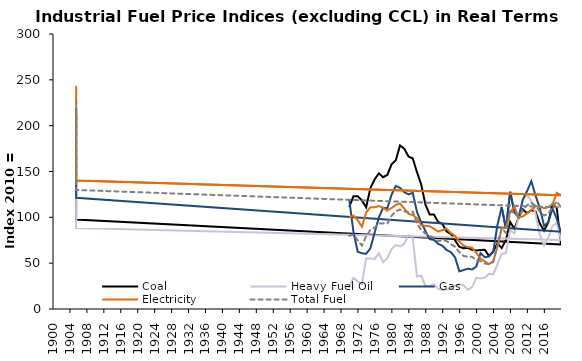
| Category | Coal | Heavy Fuel Oil | Gas | Electricity | Total Fuel |
|---|---|---|---|---|---|
| 1970-01-01 | 111.516 | 24.5 | 119.719 | 99.851 | 79.811 |
| 1971-01-01 | 122.971 | 33.936 | 84.229 | 102.041 | 81.375 |
| 1972-01-01 | 123.096 | 30.142 | 62.531 | 96.971 | 74.948 |
| 1973-01-01 | 118.387 | 27.095 | 60.768 | 89.67 | 69.19 |
| 1974-01-01 | 110.844 | 55.242 | 60.297 | 105.287 | 79.297 |
| 1975-01-01 | 131.864 | 55.18 | 66.123 | 110.923 | 86.286 |
| 1976-01-01 | 141.234 | 54.681 | 83.321 | 110.962 | 88.887 |
| 1977-01-01 | 148.103 | 60.917 | 99.926 | 112.312 | 93.299 |
| 1978-01-01 | 143.774 | 51.086 | 110.356 | 110.517 | 93.429 |
| 1979-01-01 | 146.254 | 55.453 | 110.001 | 107.329 | 93.032 |
| 1980-01-01 | 157.849 | 65.408 | 124.568 | 110.185 | 101.689 |
| 1981-01-01 | 162.258 | 69.706 | 134.321 | 113.51 | 106.484 |
| 1982-01-01 | 178.387 | 68.18 | 132.193 | 115.131 | 108.575 |
| 1983-01-01 | 174.888 | 71.134 | 127.398 | 109.509 | 106.567 |
| 1984-01-01 | 166.415 | 80.397 | 125.12 | 103.91 | 105.735 |
| 1985-01-01 | 164.124 | 77.368 | 126.756 | 102.468 | 106.221 |
| 1986-01-01 | 149.243 | 35.619 | 105.82 | 99.06 | 92.691 |
| 1987-01-01 | 135.814 | 36.161 | 94.58 | 91.267 | 86.415 |
| 1988-01-01 | 113.892 | 25.197 | 84.992 | 90.822 | 82.267 |
| 1989-01-01 | 103.2 | 25.443 | 76.182 | 90.257 | 79.623 |
| 1990-01-01 | 103.122 | 26.893 | 75.343 | 87.535 | 77.448 |
| 1991-01-01 | 94.955 | 22.083 | 71.105 | 84.538 | 73.921 |
| 1992-01-01 | 92.794 | 20.495 | 68.987 | 86.104 | 75.396 |
| 1993-01-01 | 84.456 | 21.179 | 64.387 | 87.456 | 74.023 |
| 1994-01-01 | 82.054 | 22.535 | 62.029 | 82.88 | 70.633 |
| 1995-01-01 | 74.729 | 25.548 | 56.253 | 79.713 | 67.799 |
| 1996-01-01 | 67.895 | 26.95 | 41.055 | 73.51 | 61.932 |
| 1997-01-01 | 66.204 | 25.742 | 42.454 | 69.213 | 57.936 |
| 1998-01-01 | 66.71 | 21.13 | 44.012 | 67.524 | 56.938 |
| 1999-01-01 | 64.718 | 23.825 | 43.114 | 66.903 | 56.995 |
| 2000-01-01 | 63.956 | 34.033 | 46.294 | 61.205 | 52.958 |
| 2001-01-01 | 64.478 | 33.394 | 60.946 | 55.036 | 52.173 |
| 2002-01-01 | 64.658 | 34.224 | 56.384 | 51.93 | 49.663 |
| 2003-01-01 | 57.812 | 38.521 | 57.317 | 48.985 | 48.803 |
| 2004-01-01 | 62.727 | 37.795 | 62.198 | 52.046 | 51.226 |
| 2005-01-01 | 71.564 | 48.78 | 91.859 | 67.731 | 69.864 |
| 2006-01-01 | 66.475 | 60.378 | 111.201 | 88.305 | 88.486 |
| 2007-01-01 | 75.408 | 61.043 | 87.554 | 88.504 | 82.967 |
| 2008-01-01 | 94.752 | 86.145 | 127.887 | 105.551 | 106.603 |
| 2009-01-01 | 87.482 | 82.435 | 105.347 | 111.682 | 105.008 |
| 2010-01-01 | 100 | 100 | 100 | 100 | 100 |
| 2011-01-01 | 108.665 | 118.701 | 119.68 | 100.916 | 108.478 |
| 2012-01-01 | 104.544 | 124.166 | 128.657 | 104.487 | 113.19 |
| 2013-01-01 | 107.818 | 117.739 | 139.453 | 107.78 | 115.874 |
| 2014-01-01 | 106.302 | 103.604 | 123.618 | 112.288 | 112.575 |
| 2015-01-01 | 93.291 | 81.036 | 110.088 | 111.803 | 105.963 |
| 2016-01-01 | 85.449 | 69.215 | 90.75 | 109.875 | 101.849 |
| 2017-01-01 | 94.643 | 78.182 | 94.63 | 111.176 | 104.156 |
| 2018-01-01 | 114.197 | 90.535 | 109.697 | 114.297 | 110.673 |
| 2019-01-01 | 110.246 | 94.069 | 98.183 | 126.762 | 117.545 |
| 2020-01-01 | 70.293 | 75.37 | 84.165 | 124.172 | 110.773 |
| 1905-07-13 | 97.685 | 88.358 | 121.292 | 140.105 | 129.855 |
| 1905-07-14 | 182.165 | 144.613 | 201.895 | 191.513 | 187.225 |
| 1905-07-15 | 214.762 | 167.37 | 219.332 | 243.229 | 229.874 |